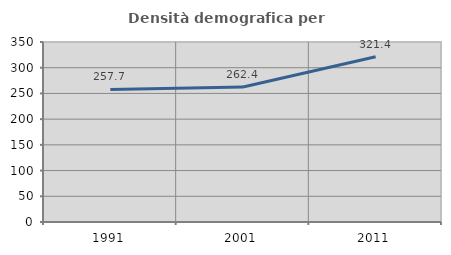
| Category | Densità demografica |
|---|---|
| 1991.0 | 257.732 |
| 2001.0 | 262.398 |
| 2011.0 | 321.387 |